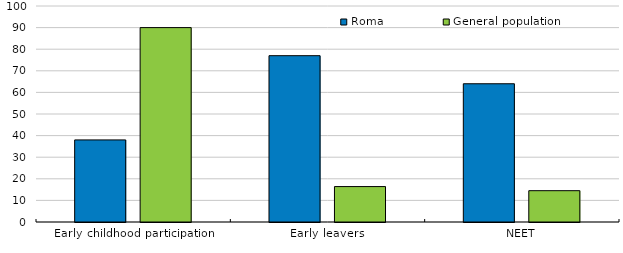
| Category | Roma | General population |
|---|---|---|
| Early childhood participation | 38 | 90 |
| Early leavers | 77 | 16.4 |
| NEET | 64 | 14.5 |